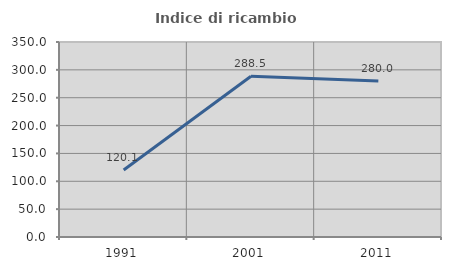
| Category | Indice di ricambio occupazionale  |
|---|---|
| 1991.0 | 120.112 |
| 2001.0 | 288.535 |
| 2011.0 | 280 |